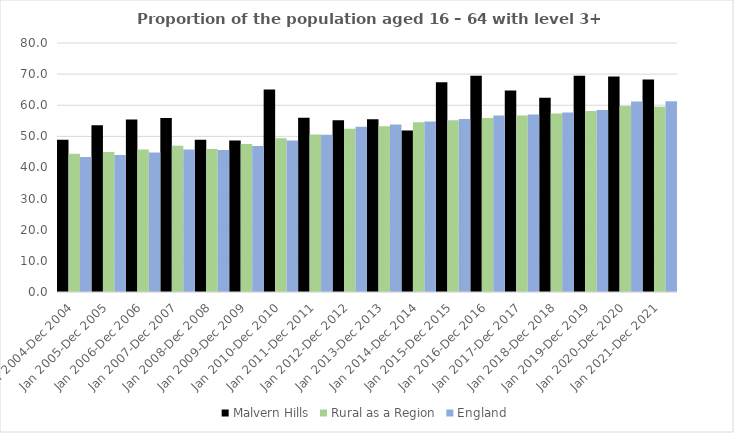
| Category | Malvern Hills | Rural as a Region | England |
|---|---|---|---|
| Jan 2004-Dec 2004 | 48.9 | 44.405 | 43.4 |
| Jan 2005-Dec 2005 | 53.6 | 44.973 | 44 |
| Jan 2006-Dec 2006 | 55.4 | 45.774 | 44.8 |
| Jan 2007-Dec 2007 | 55.9 | 46.968 | 45.8 |
| Jan 2008-Dec 2008 | 48.9 | 45.964 | 45.6 |
| Jan 2009-Dec 2009 | 48.7 | 47.59 | 46.9 |
| Jan 2010-Dec 2010 | 65.1 | 49.362 | 48.7 |
| Jan 2011-Dec 2011 | 56 | 50.602 | 50.5 |
| Jan 2012-Dec 2012 | 55.2 | 52.439 | 53.1 |
| Jan 2013-Dec 2013 | 55.5 | 53.276 | 53.8 |
| Jan 2014-Dec 2014 | 51.9 | 54.57 | 54.8 |
| Jan 2015-Dec 2015 | 67.4 | 55.16 | 55.6 |
| Jan 2016-Dec 2016 | 69.5 | 55.941 | 56.7 |
| Jan 2017-Dec 2017 | 64.7 | 56.689 | 57 |
| Jan 2018-Dec 2018 | 62.4 | 57.389 | 57.7 |
| Jan 2019-Dec 2019 | 69.5 | 58.147 | 58.5 |
| Jan 2020-Dec 2020 | 69.2 | 59.771 | 61.2 |
| Jan 2021-Dec 2021 | 68.3 | 59.54 | 61.3 |